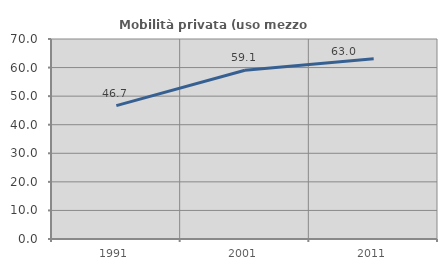
| Category | Mobilità privata (uso mezzo privato) |
|---|---|
| 1991.0 | 46.699 |
| 2001.0 | 59.077 |
| 2011.0 | 63.05 |